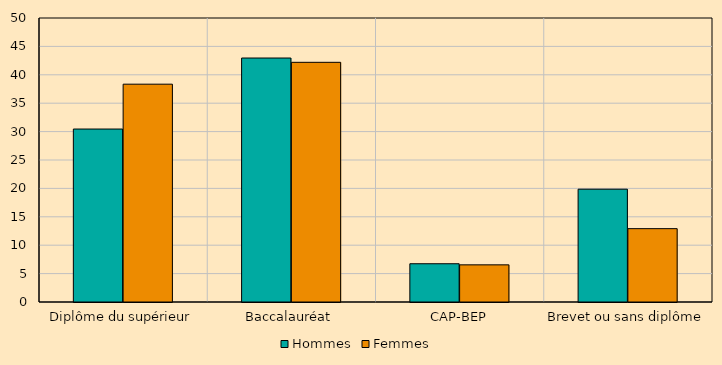
| Category | Hommes | Femmes  |
|---|---|---|
| Diplôme du supérieur | 30.451 | 38.348 |
| Baccalauréat | 42.953 | 42.198 |
| CAP-BEP | 6.735 | 6.541 |
| Brevet ou sans diplôme | 19.861 | 12.914 |